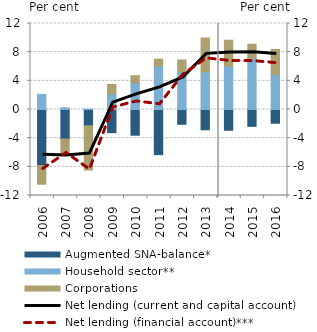
| Category | Augmented SNA-balance* | Household sector** | Corporations |
|---|---|---|---|
| 2006.0 | -7.826 | 2.119 | -2.598 |
| 2007.0 | -4.125 | 0.231 | -2.178 |
| 2008.0 | -2.271 | 0.07 | -6.178 |
| 2009.0 | -3.23 | 2.164 | 1.335 |
| 2010.0 | -3.588 | 3.731 | 0.987 |
| 2011.0 | -6.299 | 6.035 | 0.985 |
| 2012.0 | -2.063 | 5.256 | 1.661 |
| 2013.0 | -2.829 | 5.257 | 4.715 |
| 2014.0 | -2.901 | 6.039 | 3.632 |
| 2015.0 | -2.353 | 7.138 | 1.972 |
| 2016.0 | -1.917 | 4.852 | 3.526 |